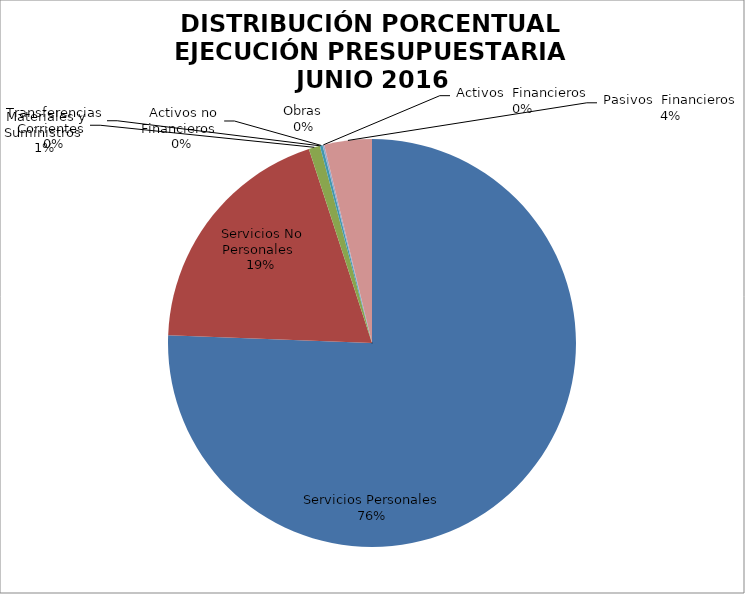
| Category | Series 0 | Series 1 |
|---|---|---|
| Servicios Personales | 11018188.24 | 0.818 |
| Servicios No Personales | 2823462.9 | 0.21 |
| Materiales y Suministros | 130194.04 | 0.01 |
| Transferencias Corrientes | 0 | 0 |
| Activos no Financieros | 31270 | 0.002 |
| Obras | 0 | 0 |
| Activos  Financieros | 19700 | 0.001 |
| Pasivos  Financieros | -548794.01 | -0.041 |